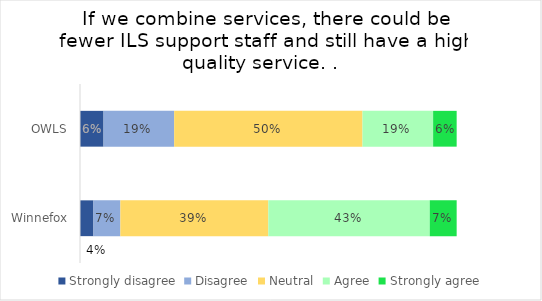
| Category | Strongly disagree | Disagree | Neutral | Agree | Strongly agree |
|---|---|---|---|---|---|
| OWLS | 0.062 | 0.188 | 0.5 | 0.188 | 0.062 |
| Winnefox | 0.036 | 0.071 | 0.393 | 0.429 | 0.071 |